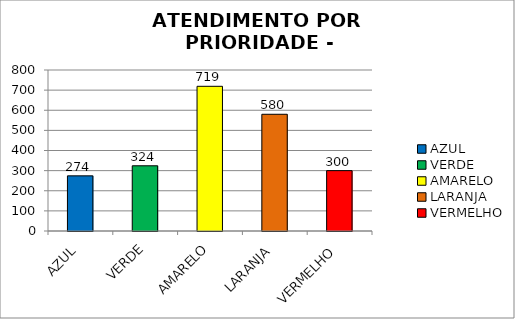
| Category | Total Regional: |
|---|---|
| AZUL | 274 |
| VERDE | 324 |
| AMARELO | 719 |
| LARANJA | 580 |
| VERMELHO | 300 |